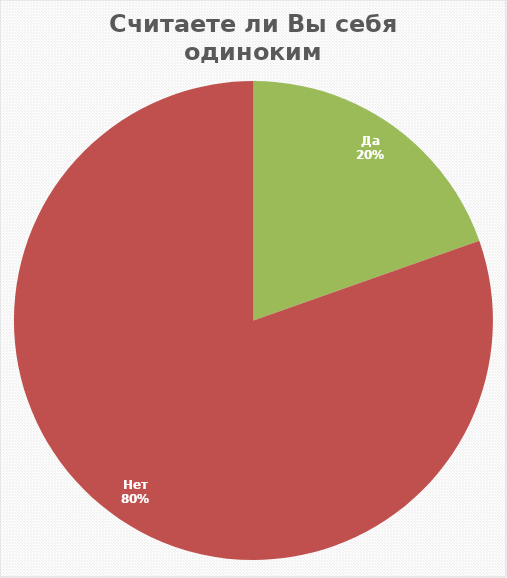
| Category | Итог |
|---|---|
| Да | 860 |
| Нет | 3530 |